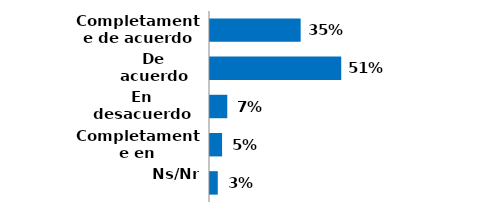
| Category | Series 0 |
|---|---|
| Completamente de acuerdo | 0.35 |
| De acuerdo | 0.507 |
| En desacuerdo | 0.067 |
| Completamente en desacuerdo | 0.047 |
| Ns/Nr | 0.03 |